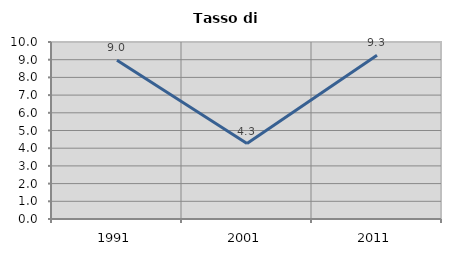
| Category | Tasso di disoccupazione   |
|---|---|
| 1991.0 | 8.965 |
| 2001.0 | 4.265 |
| 2011.0 | 9.258 |